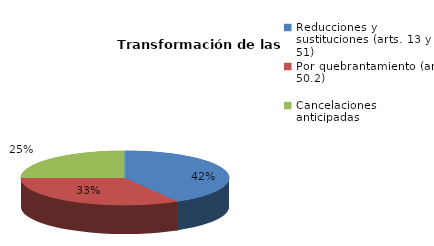
| Category | Series 0 |
|---|---|
| Reducciones y sustituciones (arts. 13 y 51) | 5 |
| Por quebrantamiento (art. 50.2) | 4 |
| Cancelaciones anticipadas | 3 |
| Traslado a Centros Penitenciarios | 0 |
| Conversión internamientos en cerrados (art. 51.2) | 0 |